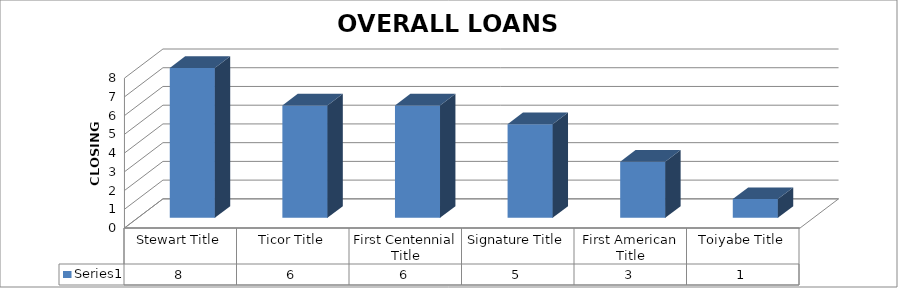
| Category | Series 0 |
|---|---|
| Stewart Title | 8 |
| Ticor Title | 6 |
| First Centennial Title | 6 |
| Signature Title | 5 |
| First American Title | 3 |
| Toiyabe Title | 1 |